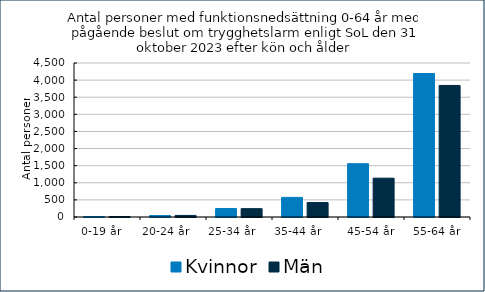
| Category | Kvinnor | Män  |
|---|---|---|
| 0-19 år    | 13 | 13 |
| 20-24 år       | 42 | 46 |
| 25-34 år      | 247 | 244 |
| 35-44 år        | 573 | 422 |
| 45-54 år | 1558 | 1135 |
| 55-64 år | 4193 | 3844 |